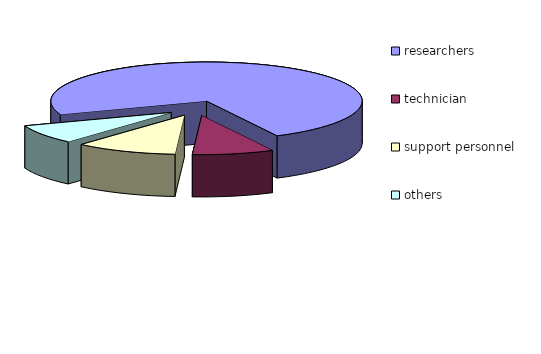
| Category | Series 0 |
|---|---|
| researchers  | 14520 |
| technician | 1681 |
| support personnel | 2100 |
| others  | 1574 |